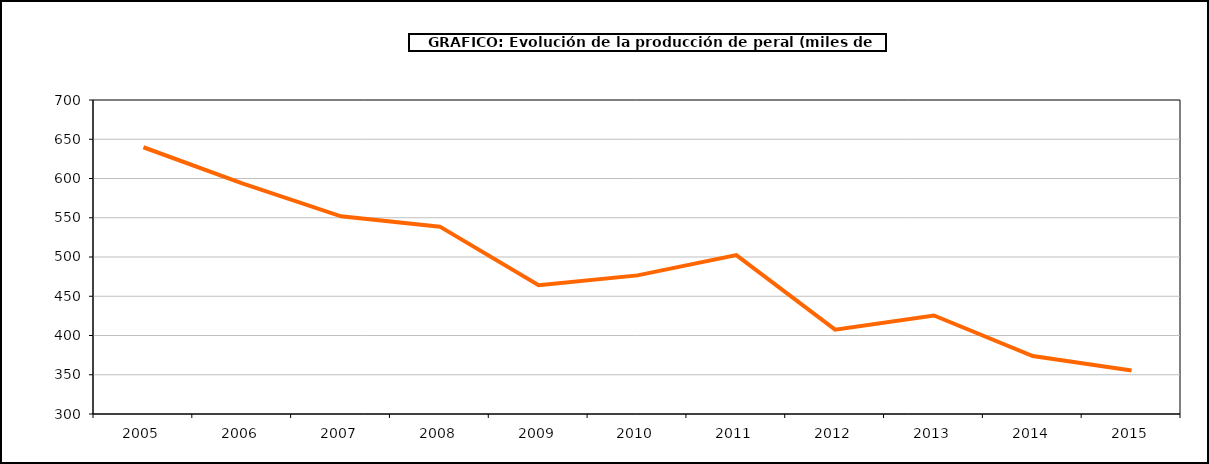
| Category | producción peral |
|---|---|
| 2005.0 | 639.809 |
| 2006.0 | 593.858 |
| 2007.0 | 551.848 |
| 2008.0 | 538.675 |
| 2009.0 | 463.969 |
| 2010.0 | 476.586 |
| 2011.0 | 502.434 |
| 2012.0 | 407.428 |
| 2013.0 | 425.56 |
| 2014.0 | 373.865 |
| 2015.0 | 355.41 |